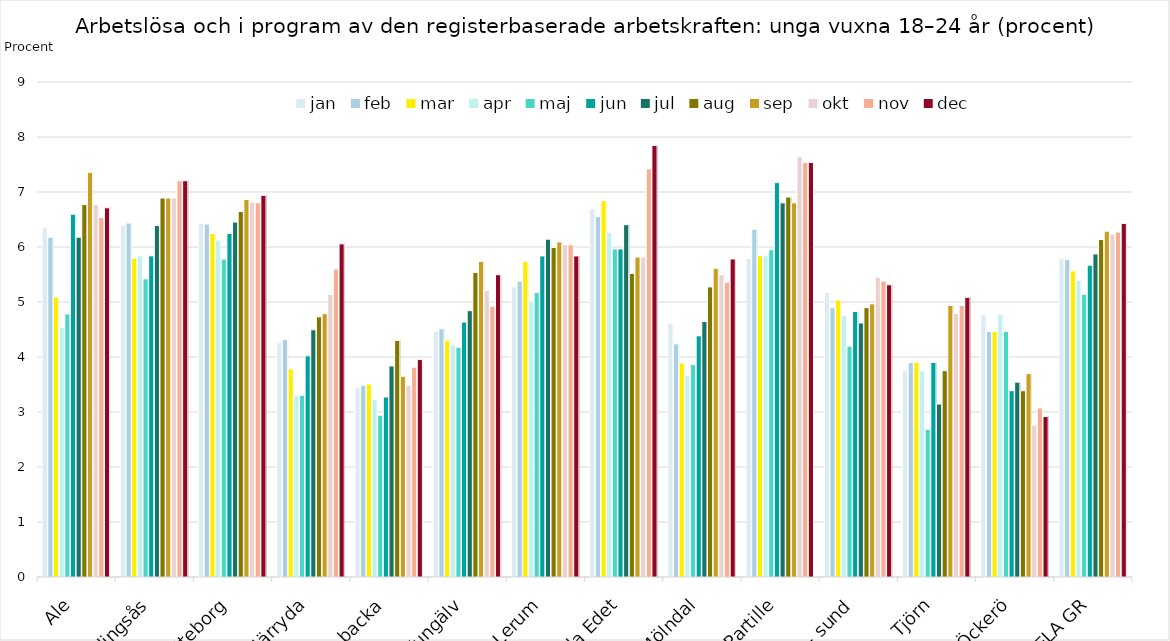
| Category | jan | feb | mar | apr | maj | jun | jul | aug | sep | okt | nov | dec |
|---|---|---|---|---|---|---|---|---|---|---|---|---|
| Ale | 6.357 | 6.178 | 5.09 | 4.537 | 4.783 | 6.595 | 6.178 | 6.772 | 7.358 | 6.772 | 6.536 | 6.713 |
| Alingsås | 6.39 | 6.436 | 5.793 | 5.839 | 5.421 | 5.839 | 6.39 | 6.89 | 6.89 | 6.89 | 7.205 | 7.205 |
| Göteborg | 6.432 | 6.417 | 6.244 | 6.123 | 5.781 | 6.247 | 6.453 | 6.646 | 6.865 | 6.814 | 6.805 | 6.94 |
| Härryda | 4.259 | 4.318 | 3.784 | 3.304 | 3.304 | 4.022 | 4.495 | 4.73 | 4.788 | 5.138 | 5.6 | 6.057 |
| Kungs- backa | 3.438 | 3.485 | 3.509 | 3.226 | 2.941 | 3.273 | 3.837 | 4.302 | 3.65 | 3.485 | 3.813 | 3.953 |
| Kungälv | 4.47 | 4.512 | 4.304 | 4.221 | 4.179 | 4.636 | 4.842 | 5.536 | 5.739 | 5.211 | 4.924 | 5.496 |
| Lerum | 5.275 | 5.378 | 5.736 | 5.016 | 5.171 | 5.838 | 6.142 | 5.99 | 6.092 | 6.041 | 6.041 | 5.838 |
| Lilla Edet | 6.698 | 6.552 | 6.843 | 6.26 | 5.965 | 5.965 | 6.406 | 5.521 | 5.818 | 5.818 | 7.419 | 7.846 |
| Mölndal | 4.617 | 4.241 | 3.892 | 3.657 | 3.863 | 4.386 | 4.646 | 5.274 | 5.614 | 5.501 | 5.359 | 5.782 |
| Partille | 5.788 | 6.325 | 5.842 | 5.842 | 5.95 | 7.171 | 6.803 | 6.908 | 6.803 | 7.64 | 7.537 | 7.537 |
| Stenung- sund | 5.175 | 4.898 | 5.036 | 4.758 | 4.197 | 4.828 | 4.619 | 4.898 | 4.967 | 5.451 | 5.382 | 5.313 |
| Tjörn | 3.75 | 3.9 | 3.9 | 3.75 | 2.686 | 3.9 | 3.145 | 3.75 | 4.938 | 4.791 | 4.938 | 5.085 |
| Öckerö | 4.769 | 4.466 | 4.466 | 4.769 | 4.466 | 3.387 | 3.543 | 3.387 | 3.698 | 2.76 | 3.074 | 2.917 |
| HELA GR | 5.786 | 5.768 | 5.568 | 5.39 | 5.142 | 5.67 | 5.873 | 6.136 | 6.288 | 6.235 | 6.272 | 6.429 |